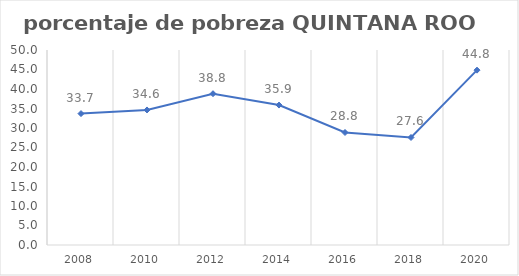
| Category | Series 0 |
|---|---|
| 2008.0 | 33.691 |
| 2010.0 | 34.627 |
| 2012.0 | 38.793 |
| 2014.0 | 35.882 |
| 2016.0 | 28.847 |
| 2018.0 | 27.565 |
| 2020.0 | 44.835 |